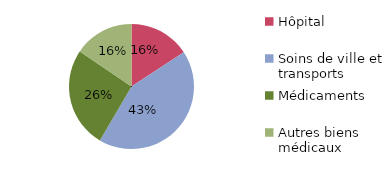
| Category | 2006 |
|---|---|
| Hôpital | 0.158 |
| Soins de ville et transports | 0.427 |
| Médicaments | 0.261 |
| Autres biens médicaux | 0.155 |